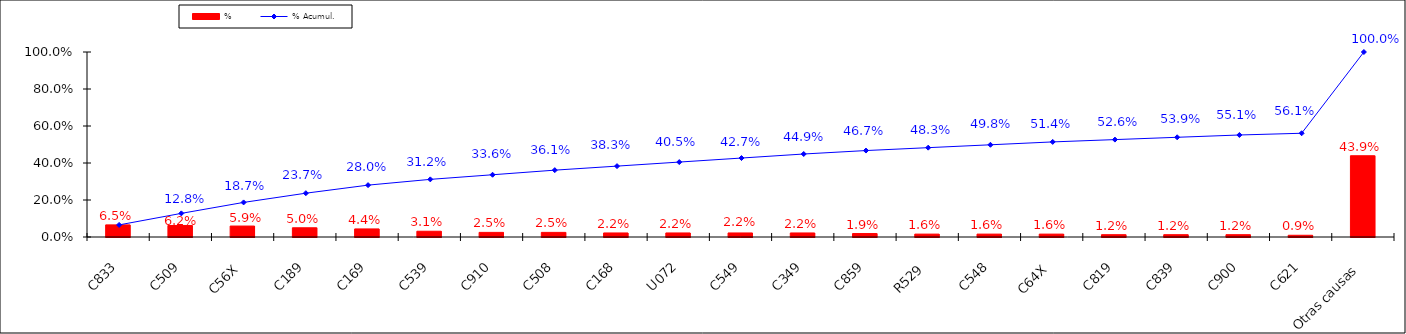
| Category | % |
|---|---|
| C833 | 0.065 |
| C509 | 0.062 |
| C56X | 0.059 |
| C189 | 0.05 |
| C169 | 0.044 |
| C539 | 0.031 |
| C910 | 0.025 |
| C508 | 0.025 |
| C168 | 0.022 |
| U072 | 0.022 |
| C549 | 0.022 |
| C349 | 0.022 |
| C859 | 0.019 |
| R529 | 0.016 |
| C548 | 0.016 |
| C64X | 0.016 |
| C819 | 0.012 |
| C839 | 0.012 |
| C900 | 0.012 |
| C621 | 0.009 |
| Otras causas | 0.439 |